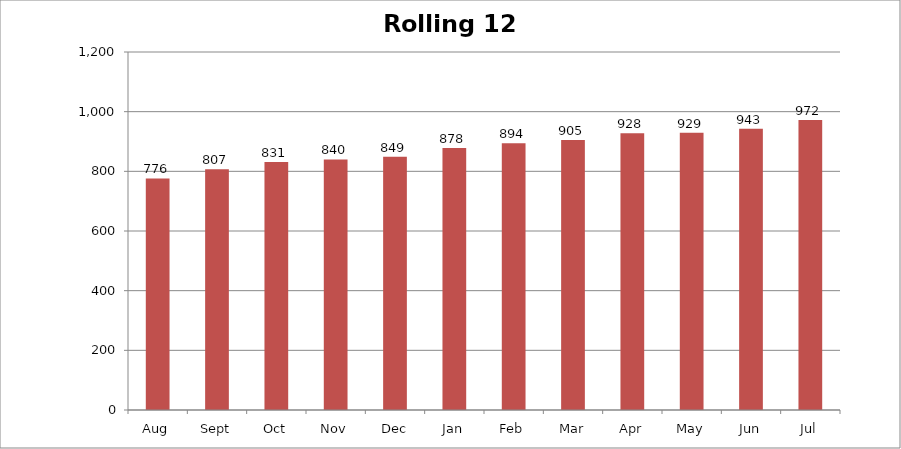
| Category | Rolling 12 Month |
|---|---|
| Aug | 776 |
| Sept | 807 |
| Oct | 831 |
| Nov | 840 |
| Dec | 849 |
| Jan | 878 |
| Feb | 894 |
| Mar | 905 |
| Apr | 928 |
| May | 929 |
| Jun | 943 |
| Jul | 972 |